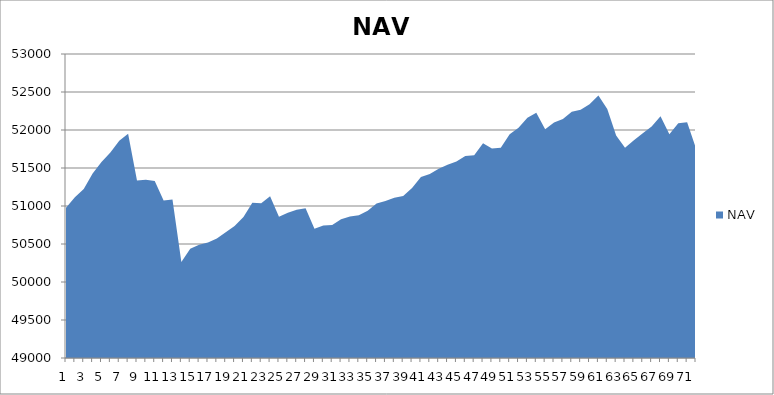
| Category | NAV |
|---|---|
| 0 | 50975.413 |
| 1 | 51115.874 |
| 2 | 51223.542 |
| 3 | 51427.364 |
| 4 | 51580.567 |
| 5 | 51704.692 |
| 6 | 51858.016 |
| 7 | 51951.766 |
| 8 | 51336.067 |
| 9 | 51345.356 |
| 10 | 51328.667 |
| 11 | 51072.985 |
| 12 | 51085.199 |
| 13 | 50261.67 |
| 14 | 50438.394 |
| 15 | 50489.896 |
| 16 | 50518.251 |
| 17 | 50572.468 |
| 18 | 50655.55 |
| 19 | 50737.787 |
| 20 | 50856.035 |
| 21 | 51041.806 |
| 22 | 51034.925 |
| 23 | 51128.589 |
| 24 | 50859.456 |
| 25 | 50911.137 |
| 26 | 50950.007 |
| 27 | 50970.175 |
| 28 | 50701.326 |
| 29 | 50743.495 |
| 30 | 50751.546 |
| 31 | 50826.725 |
| 32 | 50860.533 |
| 33 | 50879.283 |
| 34 | 50936.644 |
| 35 | 51031.381 |
| 36 | 51065.306 |
| 37 | 51109.987 |
| 38 | 51132.251 |
| 39 | 51238.242 |
| 40 | 51380.786 |
| 41 | 51420.042 |
| 42 | 51490.787 |
| 43 | 51541.14 |
| 44 | 51584.924 |
| 45 | 51657.998 |
| 46 | 51667.348 |
| 47 | 51825.763 |
| 48 | 51755.412 |
| 49 | 51767.57 |
| 50 | 51945.15 |
| 51 | 52028.391 |
| 52 | 52160.744 |
| 53 | 52227.009 |
| 54 | 52009.927 |
| 55 | 52099.094 |
| 56 | 52144.26 |
| 57 | 52240.689 |
| 58 | 52266.163 |
| 59 | 52339.405 |
| 60 | 52453.236 |
| 61 | 52275.154 |
| 62 | 51926 |
| 63 | 51766.425 |
| 64 | 51865.11 |
| 65 | 51955.727 |
| 66 | 52045.452 |
| 67 | 52179.744 |
| 68 | 51944.5 |
| 69 | 52088.896 |
| 70 | 52102.813 |
| 71 | 51756.659 |